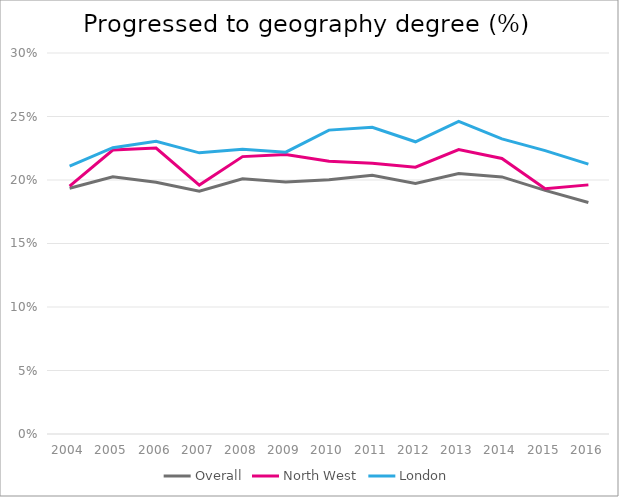
| Category | Overall | North West | London |
|---|---|---|---|
| 2004.0 | 0.193 | 0.195 | 0.211 |
| 2005.0 | 0.203 | 0.224 | 0.225 |
| 2006.0 | 0.198 | 0.225 | 0.23 |
| 2007.0 | 0.191 | 0.196 | 0.221 |
| 2008.0 | 0.201 | 0.218 | 0.224 |
| 2009.0 | 0.198 | 0.22 | 0.222 |
| 2010.0 | 0.2 | 0.215 | 0.239 |
| 2011.0 | 0.204 | 0.213 | 0.241 |
| 2012.0 | 0.197 | 0.21 | 0.23 |
| 2013.0 | 0.205 | 0.224 | 0.246 |
| 2014.0 | 0.202 | 0.217 | 0.232 |
| 2015.0 | 0.192 | 0.193 | 0.223 |
| 2016.0 | 0.182 | 0.196 | 0.213 |